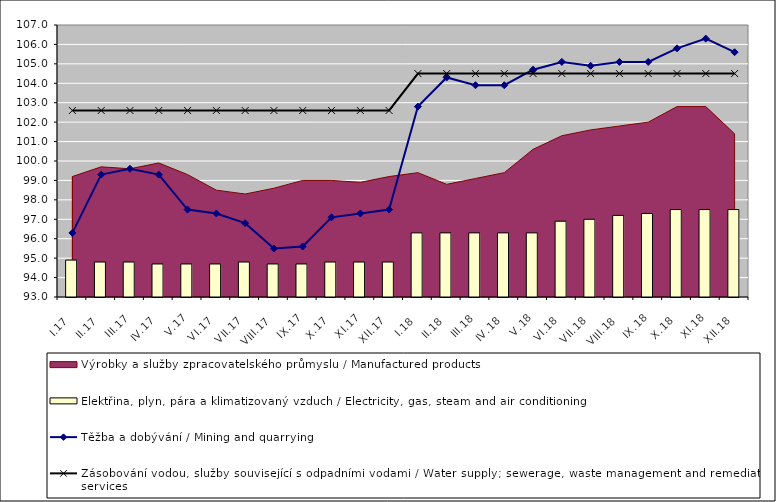
| Category | Elektřina, plyn, pára a klimatizovaný vzduch / Electricity, gas, steam and air conditioning |
|---|---|
| I.17 | 94.9 |
| II.17 | 94.8 |
| III.17 | 94.8 |
| IV.17 | 94.7 |
| V.17 | 94.7 |
| VI.17 | 94.7 |
| VII.17 | 94.8 |
| VIII.17 | 94.7 |
| IX.17 | 94.7 |
| X.17 | 94.8 |
| XI.17 | 94.8 |
| XII.17 | 94.8 |
| I.18 | 96.3 |
| II.18 | 96.3 |
| III.18 | 96.3 |
| IV.18 | 96.3 |
| V.18 | 96.3 |
| VI.18 | 96.9 |
| VII.18 | 97 |
| VIII.18 | 97.2 |
| IX.18 | 97.3 |
| X.18 | 97.5 |
| XI.18 | 97.5 |
| XII.18 | 97.5 |